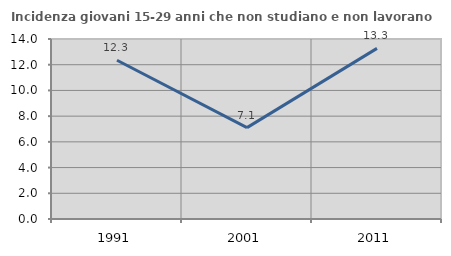
| Category | Incidenza giovani 15-29 anni che non studiano e non lavorano  |
|---|---|
| 1991.0 | 12.346 |
| 2001.0 | 7.105 |
| 2011.0 | 13.271 |